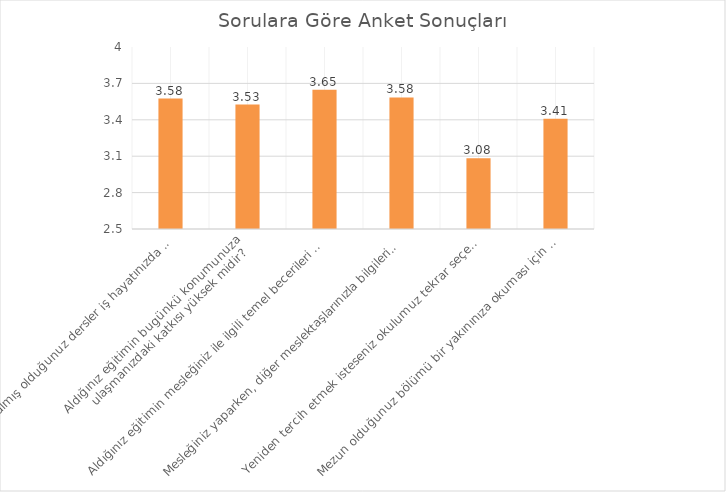
| Category | Series 0 |
|---|---|
| Bölümünüzde almış olduğunuz dersler iş hayatınızda yeterli ve güncel midir? | 3.575 |
| Aldığınız eğitimin bugünkü konumunuza ulaşmanızdaki katkısı yüksek midir?
 | 3.525 |
| Aldığınız eğitimin mesleğiniz ile ilgili temel becerileri kazandırmada katkısı yüksek midir? | 3.648 |
| Mesleğiniz yaparken, diğer meslektaşlarınızla bilgileriniz ve öğrenimleriniz açısından kendi bölümünüzün verimliliği yeterli midir? | 3.584 |
| Yeniden tercih etmek isteseniz okulumuz tekrar seçenekleriniz arasında mıdır? | 3.084 |
| Mezun olduğunuz bölümü bir yakınınıza okuması için önerir misiniz? | 3.408 |